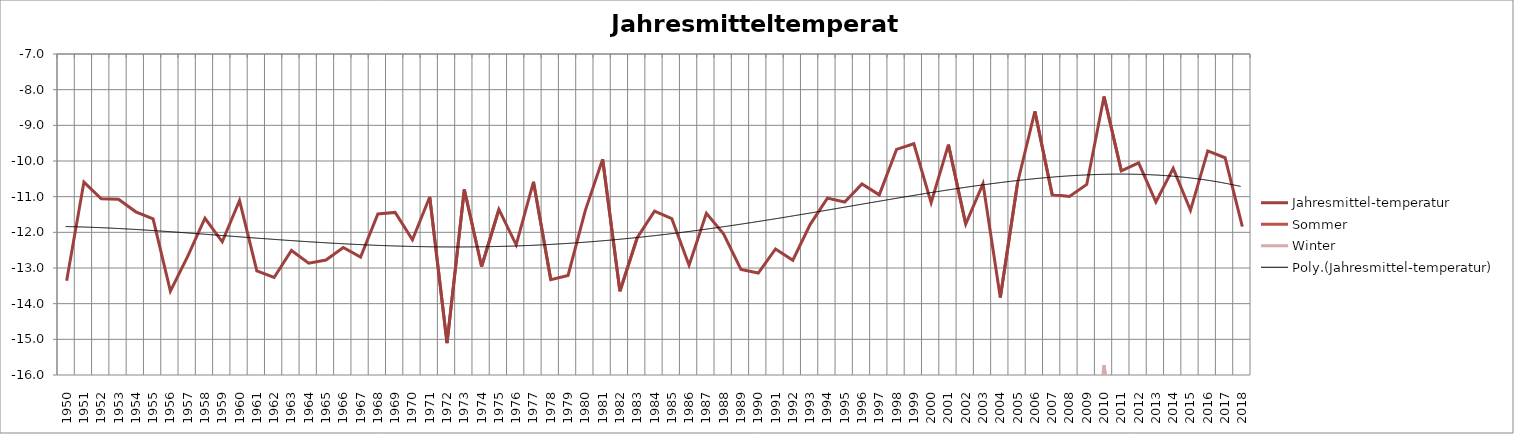
| Category | Jahresmittel-temperatur | Sommer | Winter |
|---|---|---|---|
| 1950.0 | -13.358 | 5.1 | -22.588 |
| 1951.0 | -10.591 | 6.8 | -20.529 |
| 1952.0 | -11.058 | 6.425 | -19.8 |
| 1953.0 | -11.075 | 6.85 | -20.038 |
| 1954.0 | -11.425 | 8.65 | -21.463 |
| 1955.0 | -11.625 | 7.225 | -21.05 |
| 1956.0 | -13.65 | 5.725 | -23.338 |
| 1957.0 | -12.675 | 5.95 | -21.988 |
| 1958.0 | -11.605 | 6.81 | -20.812 |
| 1959.0 | -12.267 | 5.75 | -21.275 |
| 1960.0 | -11.108 | 8.625 | -20.975 |
| 1961.0 | -13.083 | 5.725 | -22.488 |
| 1962.0 | -13.267 | 6.8 | -23.3 |
| 1963.0 | -12.508 | 5.975 | -21.75 |
| 1964.0 | -12.867 | 6.9 | -22.75 |
| 1965.0 | -12.775 | 5.25 | -21.787 |
| 1966.0 | -12.425 | 8.55 | -22.912 |
| 1967.0 | -12.692 | 6.2 | -22.138 |
| 1968.0 | -11.483 | 6.5 | -20.475 |
| 1969.0 | -11.442 | 6.475 | -20.4 |
| 1970.0 | -12.208 | 7.525 | -22.075 |
| 1971.0 | -11.008 | 7.8 | -20.412 |
| 1972.0 | -15.108 | 4.325 | -24.825 |
| 1973.0 | -10.8 | 9.45 | -20.925 |
| 1974.0 | -12.958 | 7.2 | -23.038 |
| 1975.0 | -11.358 | 8.425 | -21.25 |
| 1976.0 | -12.35 | 6.4 | -21.725 |
| 1977.0 | -10.583 | 7.225 | -19.488 |
| 1978.0 | -13.325 | 4.45 | -22.212 |
| 1979.0 | -13.208 | 5.85 | -22.737 |
| 1980.0 | -11.383 | 7.25 | -20.7 |
| 1981.0 | -9.95 | 7.625 | -18.738 |
| 1982.0 | -13.65 | 6.325 | -23.638 |
| 1983.0 | -12.15 | 7.375 | -21.912 |
| 1984.0 | -11.408 | 7.1 | -20.662 |
| 1985.0 | -11.617 | 7.55 | -21.2 |
| 1986.0 | -12.925 | 5.725 | -22.25 |
| 1987.0 | -11.467 | 5.825 | -20.112 |
| 1988.0 | -12.05 | 7.775 | -21.963 |
| 1989.0 | -13.042 | 6.975 | -23.05 |
| 1990.0 | -13.142 | 6.025 | -22.725 |
| 1991.0 | -12.467 | 7.45 | -22.425 |
| 1992.0 | -12.783 | 4.5 | -21.425 |
| 1993.0 | -11.783 | 7.575 | -21.462 |
| 1994.0 | -11.042 | 7.95 | -20.537 |
| 1995.0 | -11.15 | 7.225 | -20.338 |
| 1996.0 | -10.642 | 9.75 | -20.838 |
| 1997.0 | -10.95 | 8.175 | -20.512 |
| 1998.0 | -9.675 | 9.4 | -19.213 |
| 1999.0 | -9.517 | 7.375 | -17.963 |
| 2000.0 | -11.167 | 7.175 | -20.338 |
| 2001.0 | -9.542 | 8.525 | -18.575 |
| 2002.0 | -11.767 | 7.15 | -21.225 |
| 2003.0 | -10.633 | 7.925 | -19.912 |
| 2004.0 | -13.825 | 6.525 | -24 |
| 2005.0 | -10.608 | 7.125 | -19.475 |
| 2006.0 | -8.608 | 8.175 | -17 |
| 2007.0 | -10.942 | 7.3 | -20.062 |
| 2008.0 | -10.992 | 7.85 | -20.412 |
| 2009.0 | -10.658 | 7.775 | -19.875 |
| 2010.0 | -8.192 | 6.875 | -15.725 |
| 2011.0 | -10.275 | 8.15 | -19.488 |
| 2012.0 | -10.05 | 8.575 | -19.362 |
| 2013.0 | -11.15 | 8.6 | -21.025 |
| 2014.0 | -10.208 | 8.5 | -19.562 |
| 2015.0 | -11.383 | 7.775 | -20.962 |
| 2016.0 | -9.717 | 9.025 | -19.088 |
| 2017.0 | -9.908 | 9.45 | -19.588 |
| 2018.0 | -11.842 | 6.55 | -21.037 |